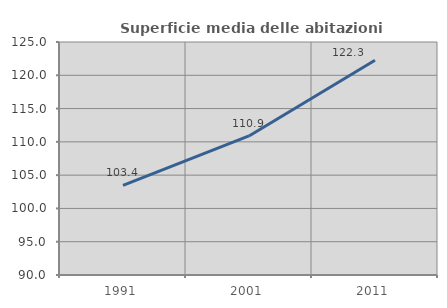
| Category | Superficie media delle abitazioni occupate |
|---|---|
| 1991.0 | 103.449 |
| 2001.0 | 110.889 |
| 2011.0 | 122.267 |